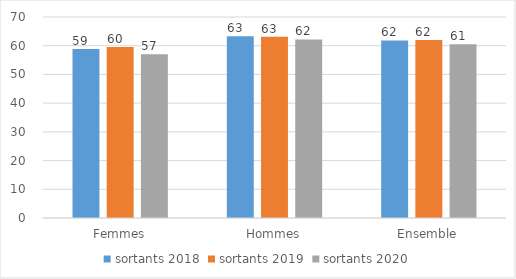
| Category | sortants 2018 | sortants 2019 | sortants 2020 |
|---|---|---|---|
| Femmes | 58.88 | 59.51 | 57 |
| Hommes | 63.26 | 63.14 | 62.19 |
| Ensemble | 61.82 | 61.98 | 60.54 |